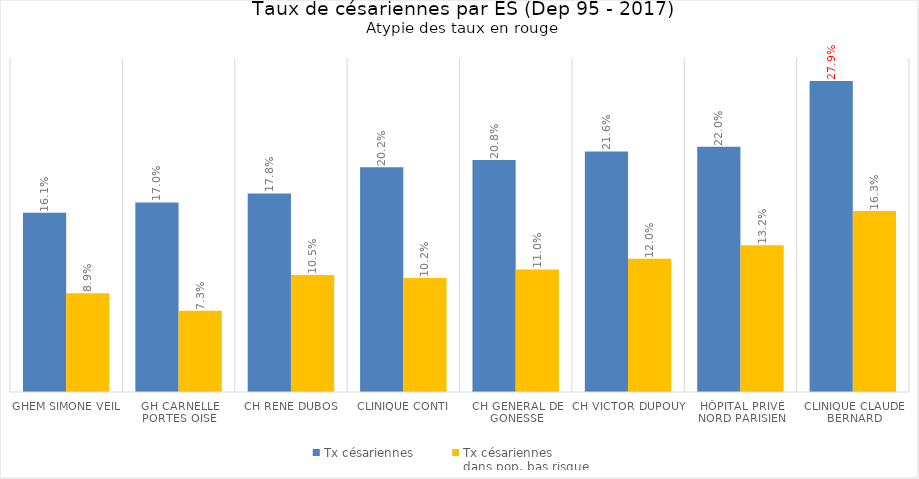
| Category | Tx césariennes | Tx césariennes 
dans pop. bas risque |
|---|---|---|
| GHEM SIMONE VEIL | 0.161 | 0.089 |
| GH CARNELLE PORTES OISE  | 0.17 | 0.073 |
| CH RENE DUBOS | 0.178 | 0.105 |
| CLINIQUE CONTI | 0.202 | 0.102 |
| CH GENERAL DE GONESSE | 0.208 | 0.11 |
| CH VICTOR DUPOUY | 0.216 | 0.12 |
| HÔPITAL PRIVÉ NORD PARISIEN | 0.22 | 0.132 |
| CLINIQUE CLAUDE BERNARD | 0.279 | 0.163 |